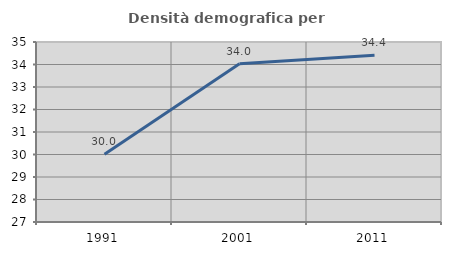
| Category | Densità demografica |
|---|---|
| 1991.0 | 30.008 |
| 2001.0 | 34.034 |
| 2011.0 | 34.408 |